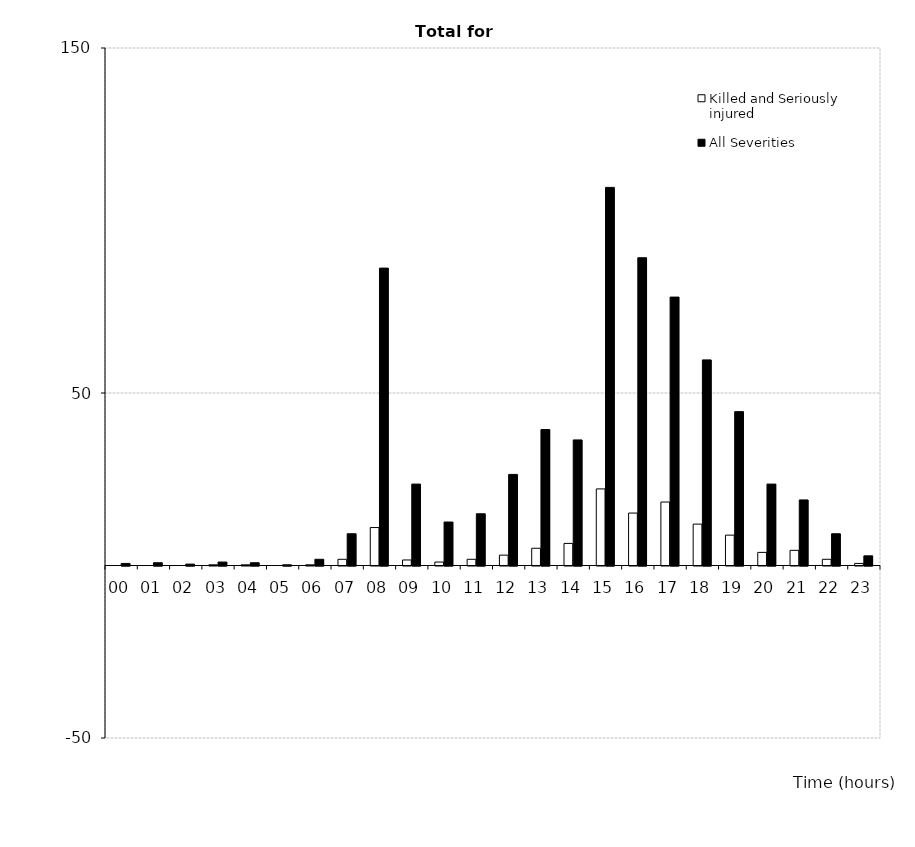
| Category | Killed and Seriously injured | All Severities |
|---|---|---|
| 00 | 0 | 0.6 |
| 01 | 0 | 0.8 |
| 02 | 0 | 0.4 |
| 03 | 0.2 | 1 |
| 04 | 0.2 | 0.8 |
| 05 | 0 | 0.2 |
| 06 | 0.2 | 1.8 |
| 07 | 1.8 | 9.2 |
| 08 | 11 | 86.2 |
| 09 | 1.6 | 23.6 |
| 10 | 1 | 12.6 |
| 11 | 1.8 | 15 |
| 12 | 3 | 26.4 |
| 13 | 5 | 39.4 |
| 14 | 6.4 | 36.4 |
| 15 | 22.2 | 109.6 |
| 16 | 15.2 | 89.2 |
| 17 | 18.4 | 77.8 |
| 18 | 12 | 59.6 |
| 19 | 8.8 | 44.6 |
| 20 | 3.8 | 23.6 |
| 21 | 4.4 | 19 |
| 22 | 1.8 | 9.2 |
| 23 | 0.6 | 2.8 |